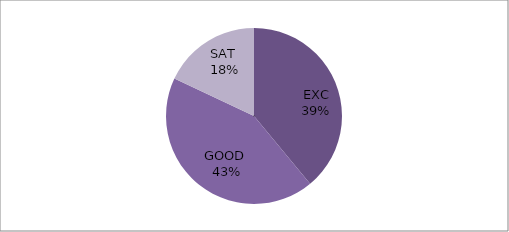
| Category | Series 0 |
|---|---|
| EXC | 39 |
| GOOD  | 43 |
| SAT  | 18 |